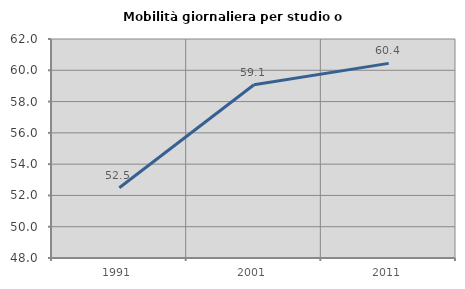
| Category | Mobilità giornaliera per studio o lavoro |
|---|---|
| 1991.0 | 52.487 |
| 2001.0 | 59.076 |
| 2011.0 | 60.442 |